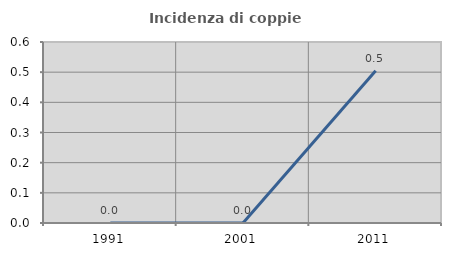
| Category | Incidenza di coppie miste |
|---|---|
| 1991.0 | 0 |
| 2001.0 | 0 |
| 2011.0 | 0.505 |